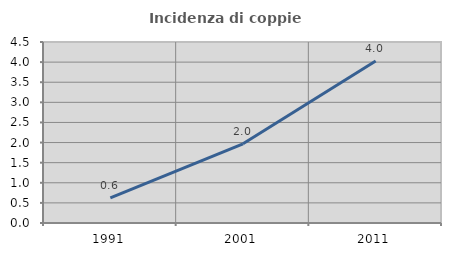
| Category | Incidenza di coppie miste |
|---|---|
| 1991.0 | 0.626 |
| 2001.0 | 1.968 |
| 2011.0 | 4.026 |